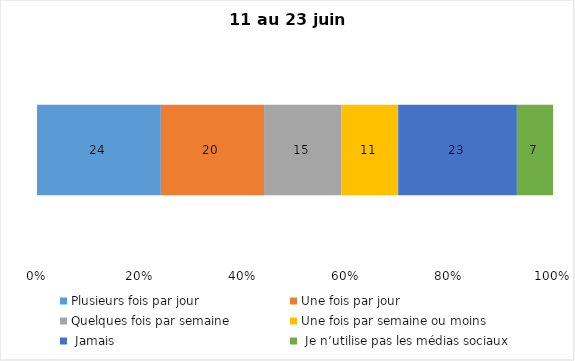
| Category | Plusieurs fois par jour | Une fois par jour | Quelques fois par semaine   | Une fois par semaine ou moins   |  Jamais   |  Je n’utilise pas les médias sociaux |
|---|---|---|---|---|---|---|
| 0 | 24 | 20 | 15 | 11 | 23 | 7 |